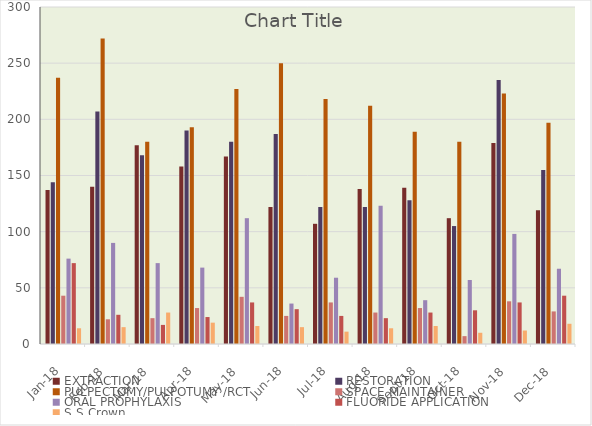
| Category | EXTRACTION | RESTORATION | PULPECTOMY/PULPOTUMY /RCT | SPACE MAINTAINER | ORAL PROPHYLAXIS | FLUORIDE APPLICATION | S.S Crown  |
|---|---|---|---|---|---|---|---|
| 2018-01-01 | 137 | 144 | 237 | 43 | 76 | 72 | 14 |
| 2018-02-01 | 140 | 207 | 272 | 22 | 90 | 26 | 15 |
| 2018-03-01 | 177 | 168 | 180 | 23 | 72 | 17 | 28 |
| 2018-04-01 | 158 | 190 | 193 | 32 | 68 | 24 | 19 |
| 2018-05-01 | 167 | 180 | 227 | 42 | 112 | 37 | 16 |
| 2018-06-01 | 122 | 187 | 250 | 25 | 36 | 31 | 15 |
| 2018-07-01 | 107 | 122 | 218 | 37 | 59 | 25 | 11 |
| 2018-08-01 | 138 | 122 | 212 | 28 | 123 | 23 | 14 |
| 2018-09-01 | 139 | 128 | 189 | 32 | 39 | 28 | 16 |
| 2018-10-01 | 112 | 105 | 180 | 7 | 57 | 30 | 10 |
| 2018-11-01 | 179 | 235 | 223 | 38 | 98 | 37 | 12 |
| 2018-12-01 | 119 | 155 | 197 | 29 | 67 | 43 | 18 |